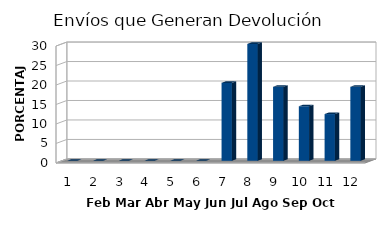
| Category | Series 0 |
|---|---|
| 0 | 0 |
| 1 | 0 |
| 2 | 0 |
| 3 | 0 |
| 4 | 0 |
| 5 | 0 |
| 6 | 20 |
| 7 | 30 |
| 8 | 19 |
| 9 | 14 |
| 10 | 12 |
| 11 | 19 |